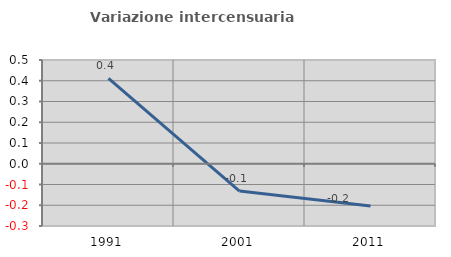
| Category | Variazione intercensuaria annua |
|---|---|
| 1991.0 | 0.411 |
| 2001.0 | -0.132 |
| 2011.0 | -0.203 |